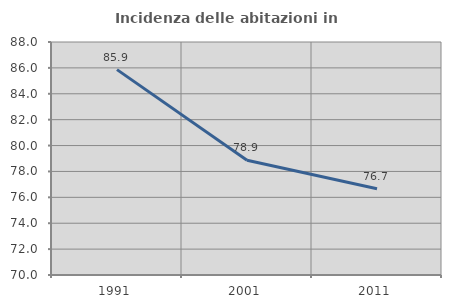
| Category | Incidenza delle abitazioni in proprietà  |
|---|---|
| 1991.0 | 85.866 |
| 2001.0 | 78.863 |
| 2011.0 | 76.658 |